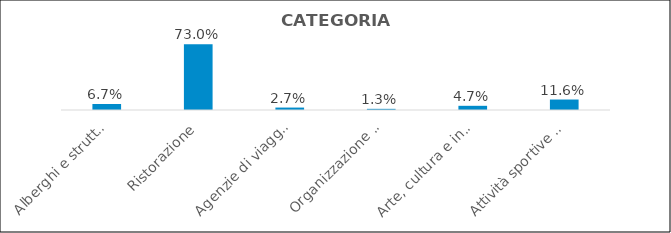
| Category | Series 0 |
|---|---|
| Alberghi e strutture ricettive | 0.067 |
| Ristorazione | 0.73 |
| Agenzie di viaggi e tour operator | 0.027 |
| Organizzazione di convegni e fiere | 0.013 |
| Arte, cultura e intrattenimento | 0.047 |
| Attività sportive e ricreative | 0.116 |